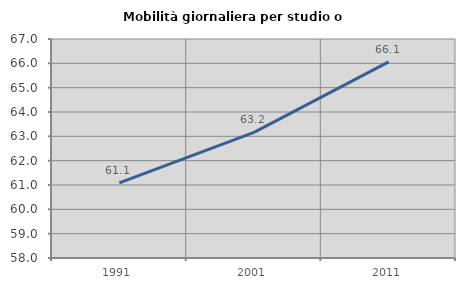
| Category | Mobilità giornaliera per studio o lavoro |
|---|---|
| 1991.0 | 61.09 |
| 2001.0 | 63.163 |
| 2011.0 | 66.059 |